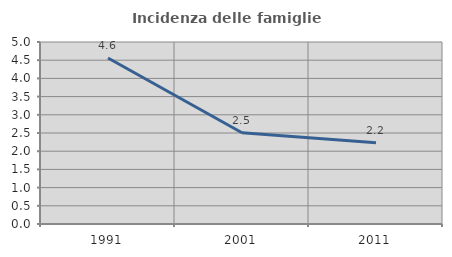
| Category | Incidenza delle famiglie numerose |
|---|---|
| 1991.0 | 4.559 |
| 2001.0 | 2.507 |
| 2011.0 | 2.232 |